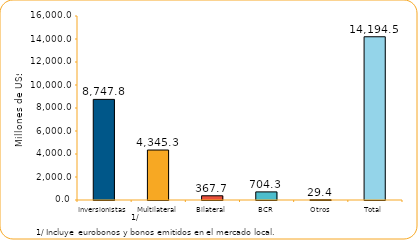
| Category | Series 1 |
|---|---|
| Inversionistas | 8747.8 |
| Multilateral | 4345.3 |
| Bilateral | 367.7 |
| BCR | 704.3 |
| Otros | 29.4 |
| Total | 14194.5 |